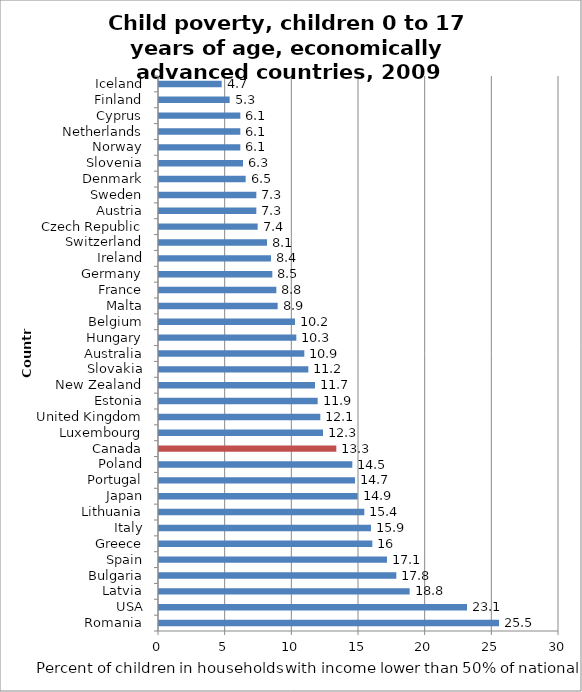
| Category | Series 0 |
|---|---|
| Romania | 25.5 |
| USA | 23.1 |
| Latvia | 18.8 |
| Bulgaria | 17.8 |
| Spain | 17.1 |
| Greece | 16 |
| Italy | 15.9 |
| Lithuania | 15.4 |
| Japan | 14.9 |
| Portugal | 14.7 |
| Poland | 14.5 |
| Canada | 13.3 |
| Luxembourg | 12.3 |
| United Kingdom | 12.1 |
| Estonia | 11.9 |
| New Zealand | 11.7 |
| Slovakia | 11.2 |
| Australia | 10.9 |
| Hungary | 10.3 |
| Belgium | 10.2 |
| Malta | 8.9 |
| France | 8.8 |
| Germany | 8.5 |
| Ireland | 8.4 |
| Switzerland | 8.1 |
| Czech Republic | 7.4 |
| Austria | 7.3 |
| Sweden | 7.3 |
| Denmark | 6.5 |
| Slovenia | 6.3 |
| Norway | 6.1 |
| Netherlands | 6.1 |
| Cyprus | 6.1 |
| Finland | 5.3 |
| Iceland | 4.7 |